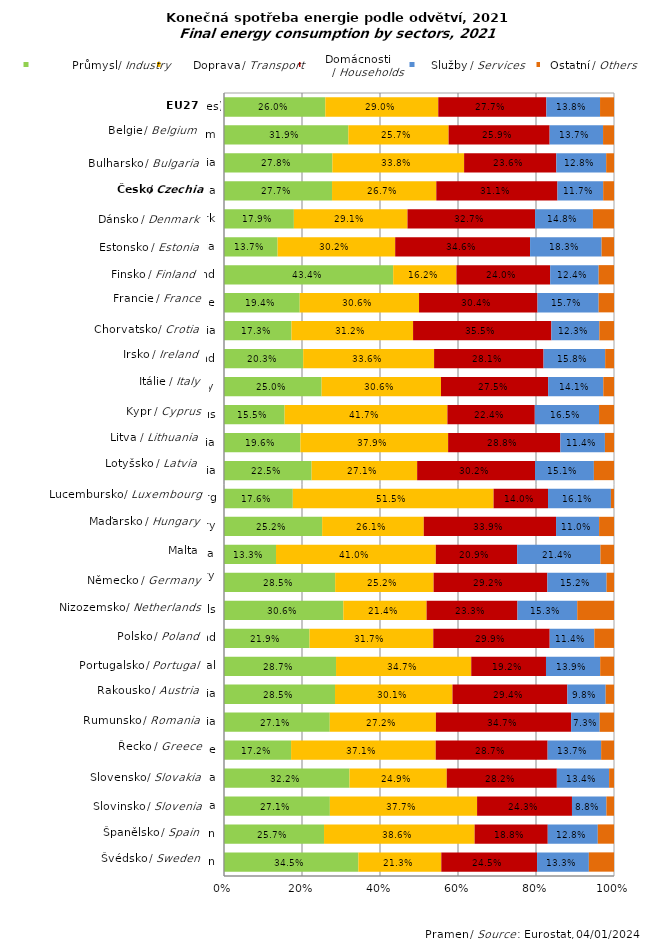
| Category | Průmysl / Industry | Doprava / Transport | Domácnosti /  | Služby / Services | ostatní / Others |
|---|---|---|---|---|---|
| Sweden | 0.345 | 0.213 | 0.245 | 0.133 | 0.064 |
| Spain | 0.257 | 0.386 | 0.188 | 0.128 | 0.042 |
| Slovenia | 0.271 | 0.377 | 0.243 | 0.088 | 0.019 |
| Slovakia | 0.322 | 0.249 | 0.282 | 0.134 | 0.013 |
| Greece | 0.172 | 0.371 | 0.287 | 0.137 | 0.033 |
| Romania | 0.271 | 0.272 | 0.347 | 0.073 | 0.037 |
| Austria | 0.285 | 0.301 | 0.294 | 0.098 | 0.021 |
| Portugal | 0.287 | 0.347 | 0.192 | 0.139 | 0.035 |
| Poland | 0.219 | 0.317 | 0.299 | 0.114 | 0.05 |
| Netherlands | 0.306 | 0.214 | 0.233 | 0.153 | 0.094 |
| Germany (until 1990 former territory of the FRG) | 0.285 | 0.252 | 0.292 | 0.152 | 0.019 |
| Malta | 0.133 | 0.41 | 0.209 | 0.214 | 0.035 |
| Hungary | 0.252 | 0.261 | 0.339 | 0.11 | 0.038 |
| Luxembourg | 0.176 | 0.515 | 0.14 | 0.161 | 0.008 |
| Latvia | 0.225 | 0.271 | 0.302 | 0.151 | 0.052 |
| Lithuania | 0.196 | 0.379 | 0.288 | 0.114 | 0.023 |
| Cyprus | 0.155 | 0.417 | 0.224 | 0.165 | 0.038 |
| Italy | 0.25 | 0.306 | 0.275 | 0.141 | 0.027 |
| Ireland | 0.203 | 0.336 | 0.281 | 0.158 | 0.023 |
| Croatia | 0.173 | 0.312 | 0.355 | 0.123 | 0.038 |
| France | 0.194 | 0.306 | 0.304 | 0.157 | 0.039 |
| Finland | 0.434 | 0.162 | 0.24 | 0.124 | 0.039 |
| Estonia | 0.137 | 0.302 | 0.346 | 0.183 | 0.032 |
| Denmark | 0.179 | 0.291 | 0.327 | 0.148 | 0.054 |
| Czechia | 0.277 | 0.267 | 0.311 | 0.117 | 0.028 |
| Bulgaria | 0.278 | 0.338 | 0.236 | 0.128 | 0.02 |
| Belgium | 0.319 | 0.257 | 0.259 | 0.137 | 0.028 |
| European Union (27 countries) | 0.26 | 0.29 | 0.277 | 0.138 | 0.036 |